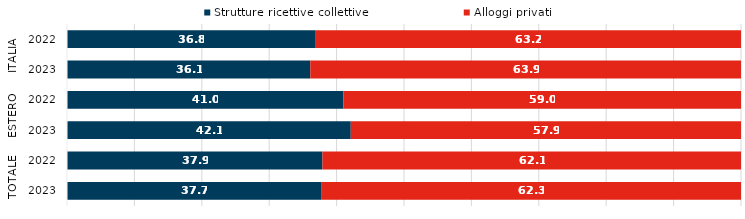
| Category | Strutture ricettive collettive | Alloggi privati |
|---|---|---|
| 0 | 36.8 | 63.2 |
| 1 | 36.1 | 63.9 |
| 2 | 41 | 59 |
| 3 | 42.1 | 57.9 |
| 4 | 37.9 | 62.1 |
| 5 | 37.7 | 62.3 |